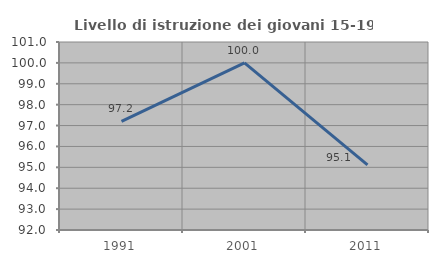
| Category | Livello di istruzione dei giovani 15-19 anni |
|---|---|
| 1991.0 | 97.196 |
| 2001.0 | 100 |
| 2011.0 | 95.122 |